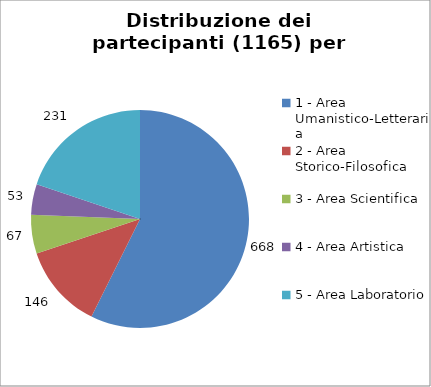
| Category | Nr. Partecipanti |
|---|---|
| 1 - Area Umanistico-Letteraria | 668 |
| 2 - Area Storico-Filosofica | 146 |
| 3 - Area Scientifica | 67 |
| 4 - Area Artistica | 53 |
| 5 - Area Laboratorio | 231 |